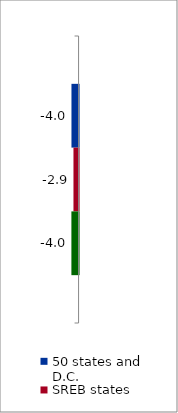
| Category | 50 states and D.C. | SREB states | State |
|---|---|---|---|
| 2010 to 2015 | -4.012 | -2.883 | -4.049 |